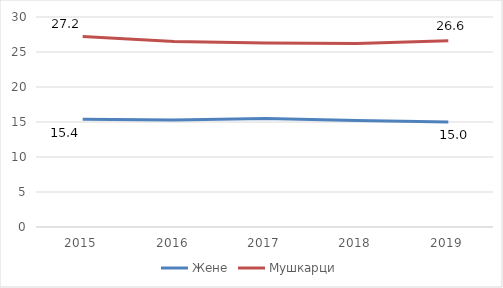
| Category | Жене | Мушкарци |
|---|---|---|
| 2015.0 | 15.4 | 27.2 |
| 2016.0 | 15.3 | 26.5 |
| 2017.0 | 15.5 | 26.3 |
| 2018.0 | 15.2 | 26.2 |
| 2019.0 | 15 | 26.6 |